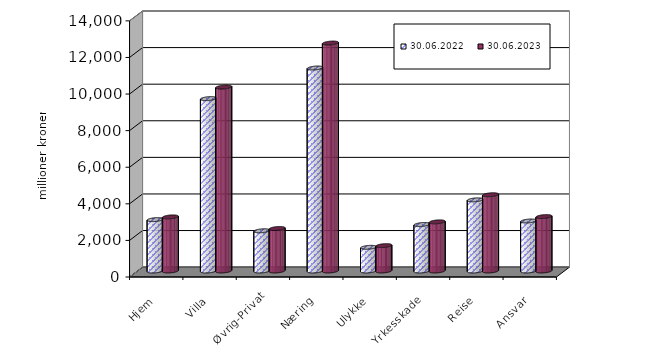
| Category | 30.06.2022 | 30.06.2023 |
|---|---|---|
| Hjem | 2809.199 | 2957.257 |
| Villa | 9423.435 | 10053.017 |
| Øvrig-Privat | 2198.713 | 2322.713 |
| Næring | 11094.916 | 12458.899 |
| Ulykke | 1294.003 | 1387.124 |
| Yrkesskade | 2541.432 | 2686.014 |
| Reise | 3888.861 | 4168.355 |
| Ansvar | 2733.321 | 2974.574 |